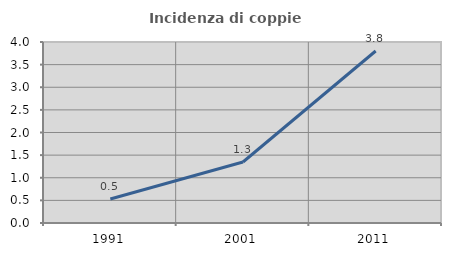
| Category | Incidenza di coppie miste |
|---|---|
| 1991.0 | 0.531 |
| 2001.0 | 1.348 |
| 2011.0 | 3.801 |